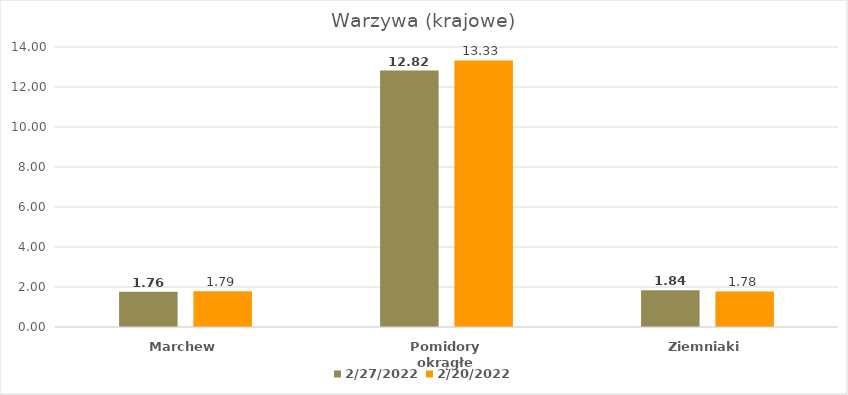
| Category | 2022-02-27 | 2022-02-20 |
|---|---|---|
| Marchew | 1.76 | 1.79 |
| Pomidory okrągłe | 12.82 | 13.33 |
| Ziemniaki | 1.84 | 1.78 |